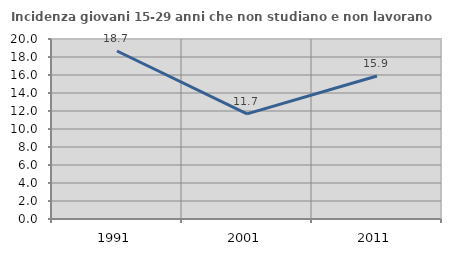
| Category | Incidenza giovani 15-29 anni che non studiano e non lavorano  |
|---|---|
| 1991.0 | 18.668 |
| 2001.0 | 11.681 |
| 2011.0 | 15.888 |